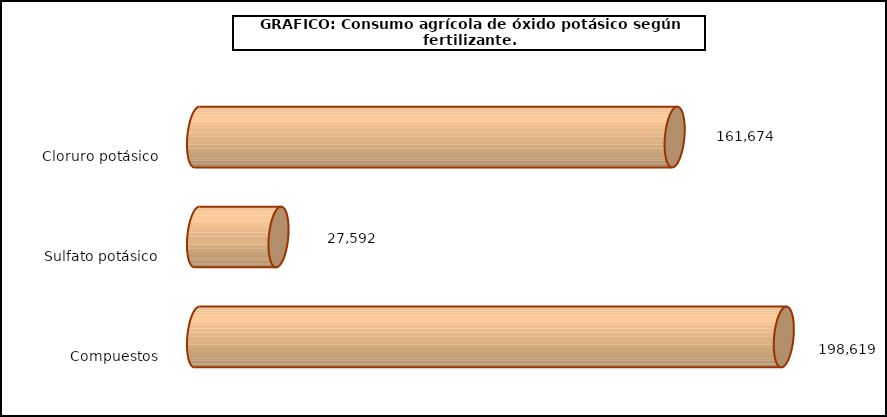
| Category | fert. N |
|---|---|
| 0 | 161674 |
| 1 | 27592 |
| 2 | 198619 |